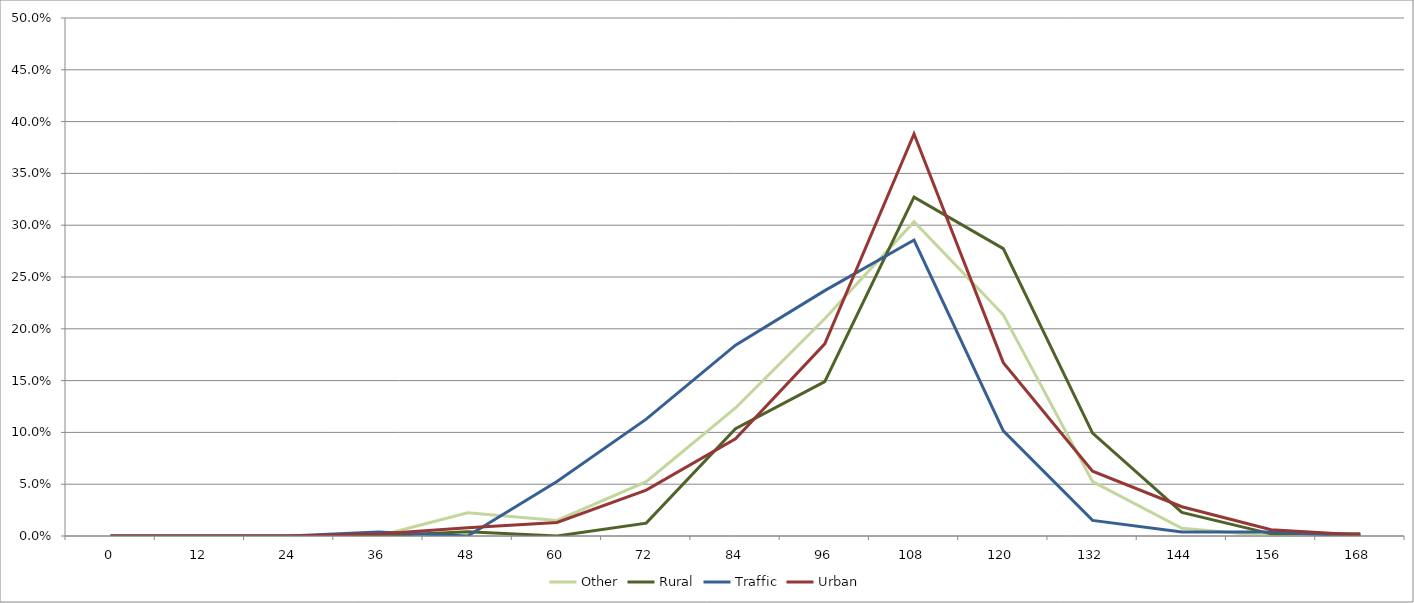
| Category | Other | Rural | Traffic | Urban |
|---|---|---|---|---|
| 0.0 | 0 | 0 | 0 | 0 |
| 12.0 | 0 | 0 | 0 | 0 |
| 24.0 | 0 | 0 | 0 | 0 |
| 36.0 | 0 | 0 | 0.004 | 0.002 |
| 48.0 | 0.022 | 0.004 | 0 | 0.008 |
| 60.0 | 0.015 | 0 | 0.053 | 0.013 |
| 72.0 | 0.052 | 0.012 | 0.113 | 0.044 |
| 84.0 | 0.124 | 0.104 | 0.184 | 0.094 |
| 96.0 | 0.21 | 0.149 | 0.237 | 0.185 |
| 108.0 | 0.303 | 0.327 | 0.286 | 0.388 |
| 120.0 | 0.213 | 0.277 | 0.102 | 0.167 |
| 132.0 | 0.052 | 0.099 | 0.015 | 0.062 |
| 144.0 | 0.007 | 0.023 | 0.004 | 0.028 |
| 156.0 | 0 | 0.002 | 0.004 | 0.006 |
| 168.0 | 0 | 0.002 | 0 | 0.001 |